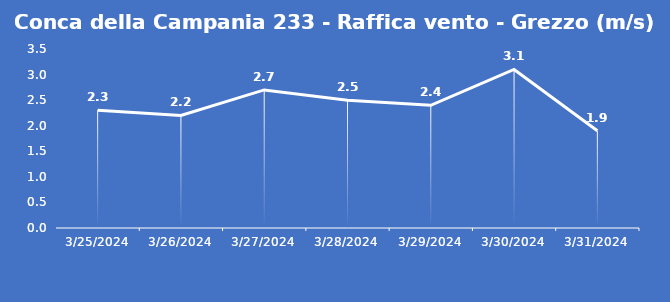
| Category | Conca della Campania 233 - Raffica vento - Grezzo (m/s) |
|---|---|
| 3/25/24 | 2.3 |
| 3/26/24 | 2.2 |
| 3/27/24 | 2.7 |
| 3/28/24 | 2.5 |
| 3/29/24 | 2.4 |
| 3/30/24 | 3.1 |
| 3/31/24 | 1.9 |